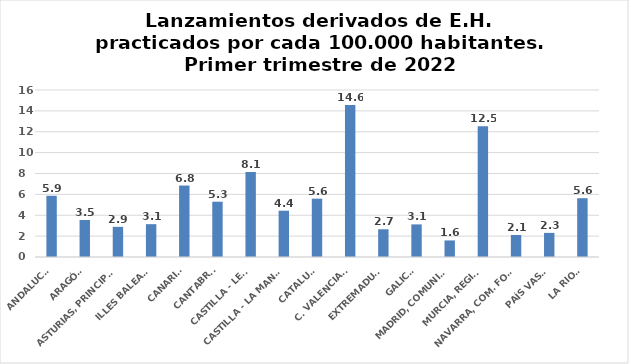
| Category | Series 0 |
|---|---|
| ANDALUCÍA | 5.865 |
| ARAGÓN | 3.546 |
| ASTURIAS, PRINCIPADO | 2.887 |
| ILLES BALEARS | 3.146 |
| CANARIAS | 6.846 |
| CANTABRIA | 5.297 |
| CASTILLA - LEÓN | 8.143 |
| CASTILLA - LA MANCHA | 4.434 |
| CATALUÑA | 5.589 |
| C. VALENCIANA | 14.556 |
| EXTREMADURA | 2.656 |
| GALICIA | 3.124 |
| MADRID, COMUNIDAD | 1.586 |
| MURCIA, REGIÓN | 12.537 |
| NAVARRA, COM. FORAL | 2.11 |
| PAÍS VASCO | 2.311 |
| LA RIOJA | 5.634 |